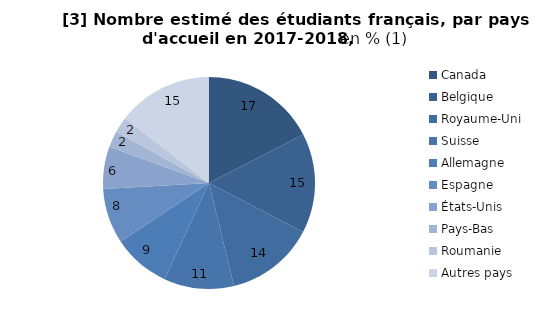
| Category | Series 0 |
|---|---|
| Canada | 17.416 |
| Belgique | 15.222 |
| Royaume-Uni  | 13.565 |
| Suisse | 10.684 |
| Allemagne | 8.8 |
| Espagne | 8.406 |
| États-Unis  | 6.468 |
| Pays-Bas | 2.481 |
| Roumanie | 2.403 |
| Autres pays | 14.555 |